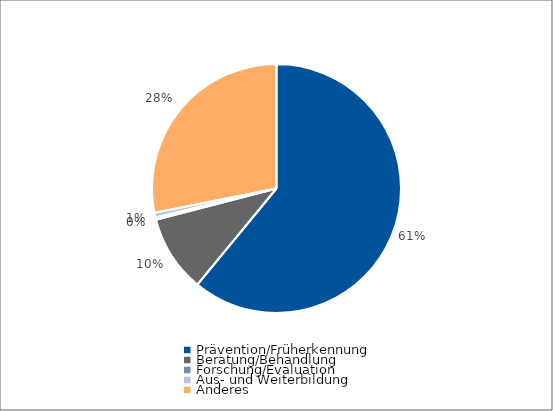
| Category | Series 0 |
|---|---|
| Prävention/Früherkennung | 195002.64 |
| Beratung/Behandlung | 31971.3 |
| Forschung/Evaluation | 973.23 |
| Aus- und Weiterbildung | 1938.68 |
| Anderes | 90000 |